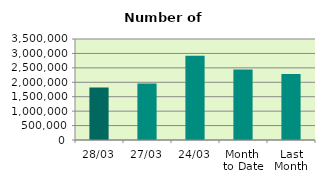
| Category | Series 0 |
|---|---|
| 28/03 | 1818212 |
| 27/03 | 1961836 |
| 24/03 | 2916368 |
| Month 
to Date | 2445565.5 |
| Last
Month | 2290810.7 |